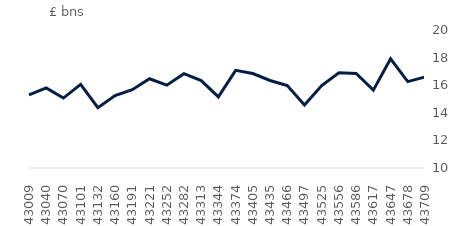
| Category | value |
|---|---|
| 2017-10-01 | 15301.947 |
| 2017-11-01 | 15806.291 |
| 2017-12-01 | 15068.495 |
| 2018-01-01 | 16057.887 |
| 2018-02-01 | 14372.511 |
| 2018-03-01 | 15250.011 |
| 2018-04-01 | 15675.009 |
| 2018-05-01 | 16466.962 |
| 2018-06-01 | 16001.812 |
| 2018-07-01 | 16831.735 |
| 2018-08-01 | 16329.966 |
| 2018-09-01 | 15152.354 |
| 2018-10-01 | 17074.411 |
| 2018-11-01 | 16848.266 |
| 2018-12-01 | 16341.231 |
| 2019-01-01 | 15973.876 |
| 2019-02-01 | 14564.532 |
| 2019-03-01 | 15970.533 |
| 2019-04-01 | 16894.454 |
| 2019-05-01 | 16853.334 |
| 2019-06-01 | 15641.377 |
| 2019-07-01 | 17908.197 |
| 2019-08-01 | 16256.762 |
| 2019-09-01 | 16593.69 |